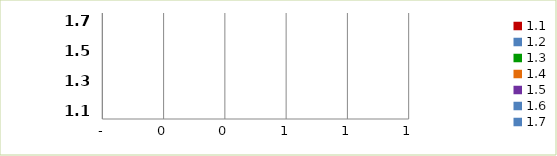
| Category | Series 0 |
|---|---|
| 1.1 | 0 |
| 1.2 | 0 |
| 1.3 | 0 |
| 1.4 | 0 |
| 1.5 | 0 |
| 1.6 | 0 |
| 1.7 | 0 |